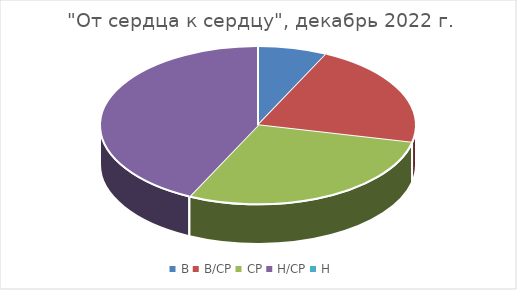
| Category |  "От сердца к сердцу" |
|---|---|
| В | 1 |
| В/СР | 3 |
| СР | 4 |
| Н/СР | 6 |
| Н | 0 |